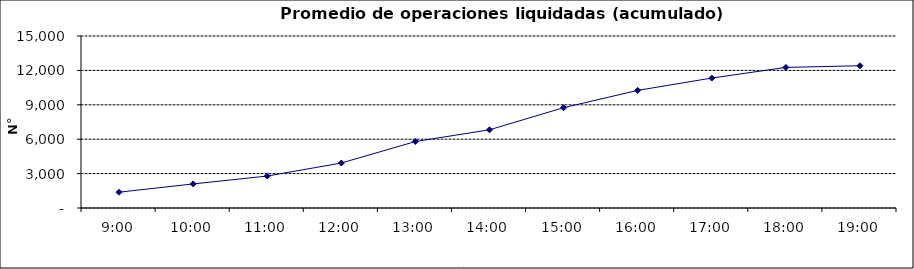
| Category | Promedio Op.Liquidadas (acumulado) |
|---|---|
| 0.375 | 1378.3 |
| 0.4166666666666667 | 2098.8 |
| 0.4583333333333333 | 2787.45 |
| 0.5 | 3922.4 |
| 0.5416666666666666 | 5797.6 |
| 0.5833333333333334 | 6821.35 |
| 0.625 | 8749.1 |
| 0.6666666666666666 | 10257.4 |
| 0.7083333333333334 | 11332.85 |
| 0.75 | 12260.55 |
| 0.7916666666666666 | 12406.25 |